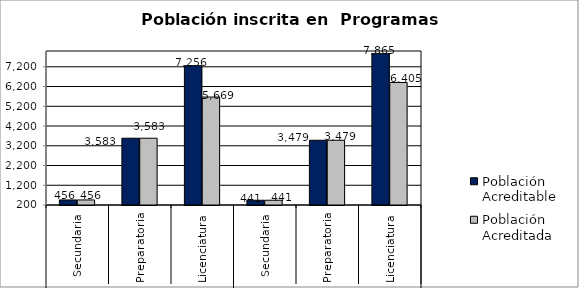
| Category | Población Acreditable | Población Acreditada |
|---|---|---|
| 0 | 456 | 456 |
| 1 | 3583 | 3583 |
| 2 | 7256 | 5669 |
| 3 | 441 | 441 |
| 4 | 3479 | 3479 |
| 5 | 7865 | 6405 |